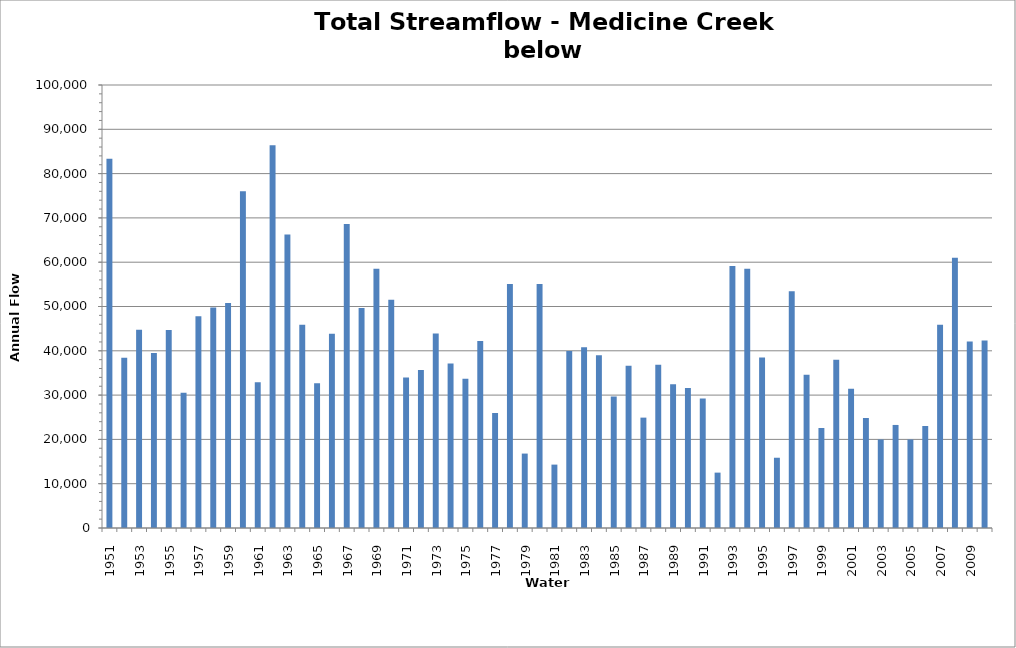
| Category | Total Streamflow |
|---|---|
| 1951.0 | 83348.455 |
| 1952.0 | 38457.09 |
| 1953.0 | 44741.016 |
| 1954.0 | 39476.212 |
| 1955.0 | 44721.776 |
| 1956.0 | 30518.131 |
| 1957.0 | 47775.374 |
| 1958.0 | 49768.395 |
| 1959.0 | 50772.443 |
| 1960.0 | 75989.075 |
| 1961.0 | 32920.546 |
| 1962.0 | 86404.83 |
| 1963.0 | 66253.66 |
| 1964.0 | 45885.892 |
| 1965.0 | 32655.352 |
| 1966.0 | 43829.598 |
| 1967.0 | 68601.331 |
| 1968.0 | 49654.007 |
| 1969.0 | 58536.06 |
| 1970.0 | 51521.413 |
| 1971.0 | 33946.333 |
| 1972.0 | 35650.517 |
| 1973.0 | 43902.035 |
| 1974.0 | 37144.33 |
| 1975.0 | 33685.661 |
| 1976.0 | 42227.783 |
| 1977.0 | 25958.66 |
| 1978.0 | 55056.347 |
| 1979.0 | 16800.523 |
| 1980.0 | 55061.226 |
| 1981.0 | 14310.576 |
| 1982.0 | 39942.057 |
| 1983.0 | 40791.828 |
| 1984.0 | 38986.486 |
| 1985.0 | 29670.958 |
| 1986.0 | 36613.129 |
| 1987.0 | 24916.39 |
| 1988.0 | 36823.38 |
| 1989.0 | 32425.941 |
| 1990.0 | 31583.667 |
| 1991.0 | 29260.275 |
| 1992.0 | 12500.394 |
| 1993.0 | 59137.219 |
| 1994.0 | 58501.607 |
| 1995.0 | 38502 |
| 1996.0 | 15860 |
| 1997.0 | 53432 |
| 1998.0 | 34614 |
| 1999.0 | 22578 |
| 2000.0 | 37975 |
| 2001.0 | 31452 |
| 2002.0 | 24835 |
| 2003.0 | 19975.7 |
| 2004.0 | 23262 |
| 2005.0 | 19974 |
| 2006.0 | 23031 |
| 2007.0 | 45854 |
| 2008.0 | 61005 |
| 2009.0 | 42096 |
| 2010.0 | 42326 |